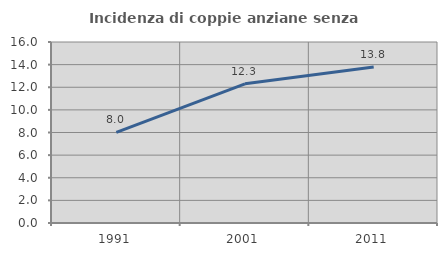
| Category | Incidenza di coppie anziane senza figli  |
|---|---|
| 1991.0 | 8.003 |
| 2001.0 | 12.303 |
| 2011.0 | 13.796 |